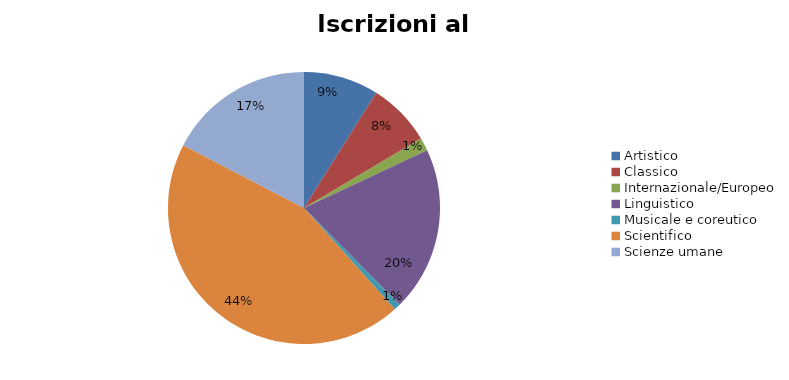
| Category | Series 0 | Series 1 |
|---|---|---|
| Artistico | 1602 |  |
| Classico | 1359 |  |
| Internazionale/Europeo | 279 |  |
| Linguistico | 3514 |  |
| Musicale e coreutico | 139 |  |
| Scientifico | 7953 |  |
| Scienze umane | 3123 |  |